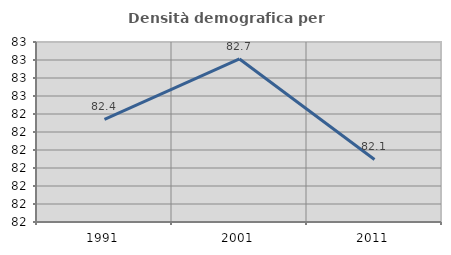
| Category | Densità demografica |
|---|---|
| 1991.0 | 82.371 |
| 2001.0 | 82.706 |
| 2011.0 | 82.147 |